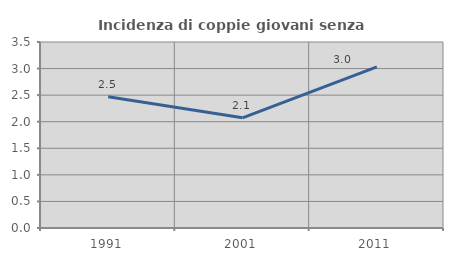
| Category | Incidenza di coppie giovani senza figli |
|---|---|
| 1991.0 | 2.469 |
| 2001.0 | 2.074 |
| 2011.0 | 3.03 |